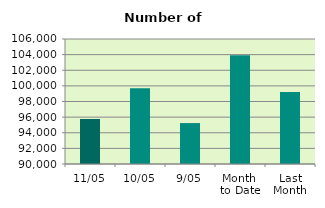
| Category | Series 0 |
|---|---|
| 11/05 | 95762 |
| 10/05 | 99698 |
| 9/05 | 95238 |
| Month 
to Date | 103905 |
| Last
Month | 99222.444 |